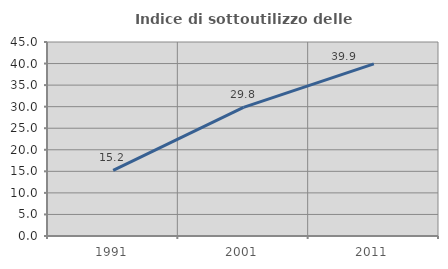
| Category | Indice di sottoutilizzo delle abitazioni  |
|---|---|
| 1991.0 | 15.243 |
| 2001.0 | 29.83 |
| 2011.0 | 39.92 |